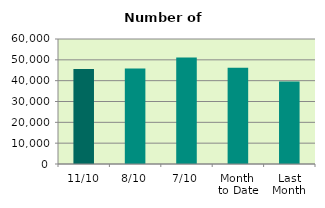
| Category | Series 0 |
|---|---|
| 11/10 | 45616 |
| 8/10 | 45786 |
| 7/10 | 51132 |
| Month 
to Date | 46237.143 |
| Last
Month | 39557.091 |